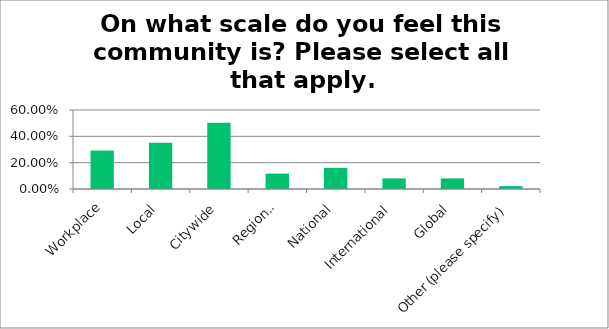
| Category | Responses |
|---|---|
| Workplace | 0.292 |
| Local | 0.35 |
| Citywide | 0.504 |
| Regional | 0.117 |
| National | 0.161 |
| International | 0.08 |
| Global | 0.08 |
| Other (please specify) | 0.022 |